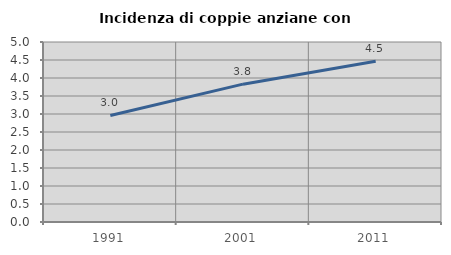
| Category | Incidenza di coppie anziane con figli |
|---|---|
| 1991.0 | 2.96 |
| 2001.0 | 3.829 |
| 2011.0 | 4.467 |